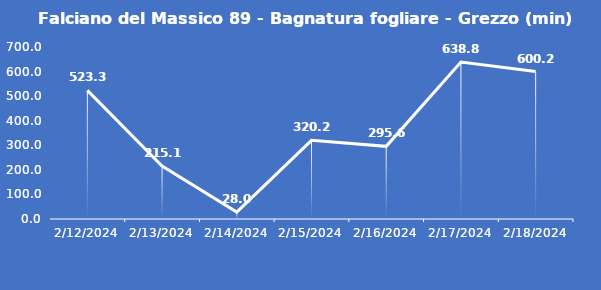
| Category | Falciano del Massico 89 - Bagnatura fogliare - Grezzo (min) |
|---|---|
| 2/12/24 | 523.3 |
| 2/13/24 | 215.1 |
| 2/14/24 | 28 |
| 2/15/24 | 320.2 |
| 2/16/24 | 295.6 |
| 2/17/24 | 638.8 |
| 2/18/24 | 600.2 |